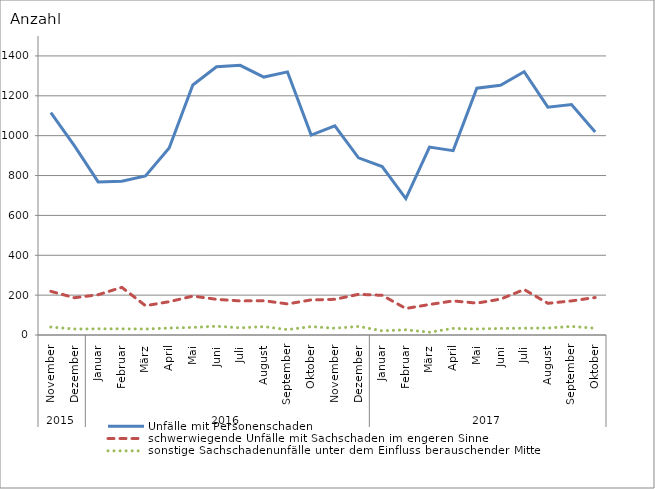
| Category | Unfälle mit Personenschaden | schwerwiegende Unfälle mit Sachschaden im engeren Sinne | sonstige Sachschadenunfälle unter dem Einfluss berauschender Mittel |
|---|---|---|---|
| 0 | 1116 | 219 | 40 |
| 1 | 949 | 187 | 30 |
| 2 | 768 | 202 | 31 |
| 3 | 771 | 239 | 31 |
| 4 | 798 | 147 | 30 |
| 5 | 938 | 167 | 35 |
| 6 | 1254 | 195 | 38 |
| 7 | 1346 | 179 | 44 |
| 8 | 1353 | 171 | 36 |
| 9 | 1294 | 172 | 42 |
| 10 | 1320 | 156 | 27 |
| 11 | 1003 | 176 | 42 |
| 12 | 1049 | 179 | 34 |
| 13 | 889 | 204 | 43 |
| 14 | 845 | 199 | 21 |
| 15 | 684 | 133 | 26 |
| 16 | 943 | 153 | 14 |
| 17 | 925 | 171 | 33 |
| 18 | 1238 | 160 | 30 |
| 19 | 1253 | 180 | 33 |
| 20 | 1321 | 228 | 34 |
| 21 | 1143 | 159 | 35 |
| 22 | 1156 | 171 | 43 |
| 23 | 1018 | 188 | 34 |